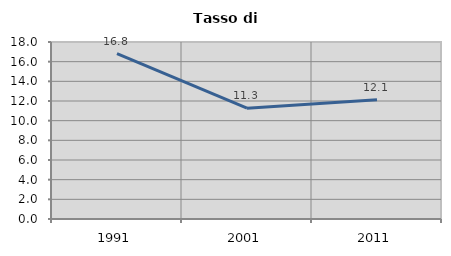
| Category | Tasso di disoccupazione   |
|---|---|
| 1991.0 | 16.827 |
| 2001.0 | 11.27 |
| 2011.0 | 12.134 |